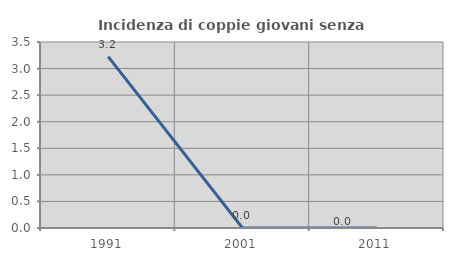
| Category | Incidenza di coppie giovani senza figli |
|---|---|
| 1991.0 | 3.226 |
| 2001.0 | 0 |
| 2011.0 | 0 |